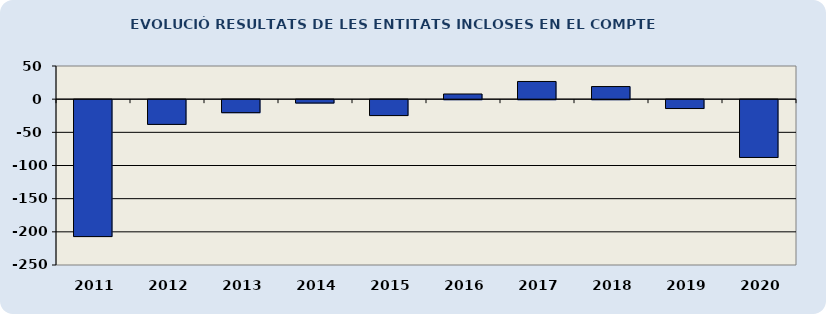
| Category | EVOLUCIÓ RESULTATS DE LES ENTITATS INCLOSES EN EL COMPTE GENERAL  |
|---|---|
| 2011.0 | -206.43 |
| 2012.0 | -37.29 |
| 2013.0 | -19.59 |
| 2014.0 | -5.08 |
| 2015.0 | -24 |
| 2016.0 | 7.8 |
| 2017.0 | 26.66 |
| 2018.0 | 19.02 |
| 2019.0 | -13.37 |
| 2020.0 | -87.13 |